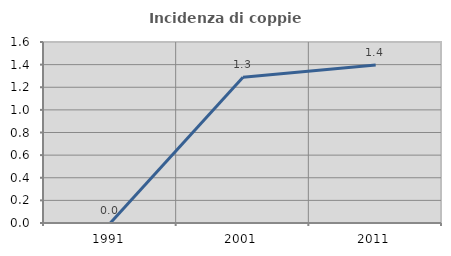
| Category | Incidenza di coppie miste |
|---|---|
| 1991.0 | 0 |
| 2001.0 | 1.289 |
| 2011.0 | 1.397 |